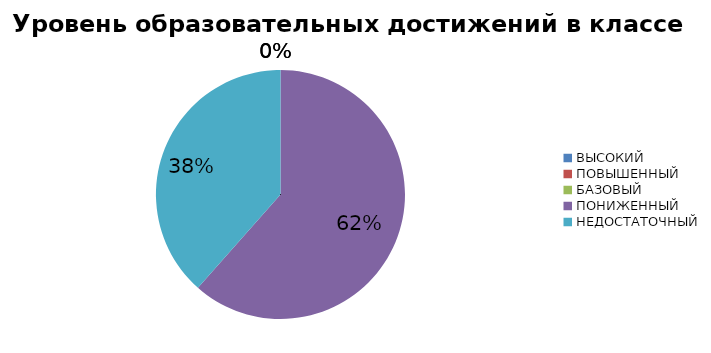
| Category | Series 0 |
|---|---|
| ВЫСОКИЙ | 0 |
| ПОВЫШЕННЫЙ | 0 |
| БАЗОВЫЙ | 0 |
| ПОНИЖЕННЫЙ | 61.538 |
| НЕДОСТАТОЧНЫЙ | 38.462 |